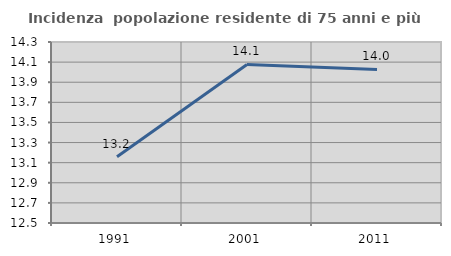
| Category | Incidenza  popolazione residente di 75 anni e più |
|---|---|
| 1991.0 | 13.158 |
| 2001.0 | 14.076 |
| 2011.0 | 14.028 |